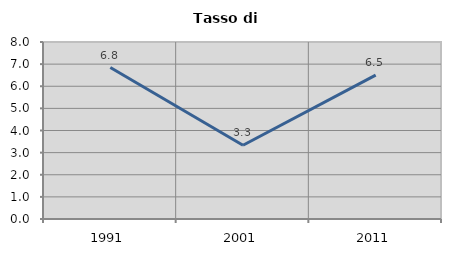
| Category | Tasso di disoccupazione   |
|---|---|
| 1991.0 | 6.844 |
| 2001.0 | 3.335 |
| 2011.0 | 6.5 |